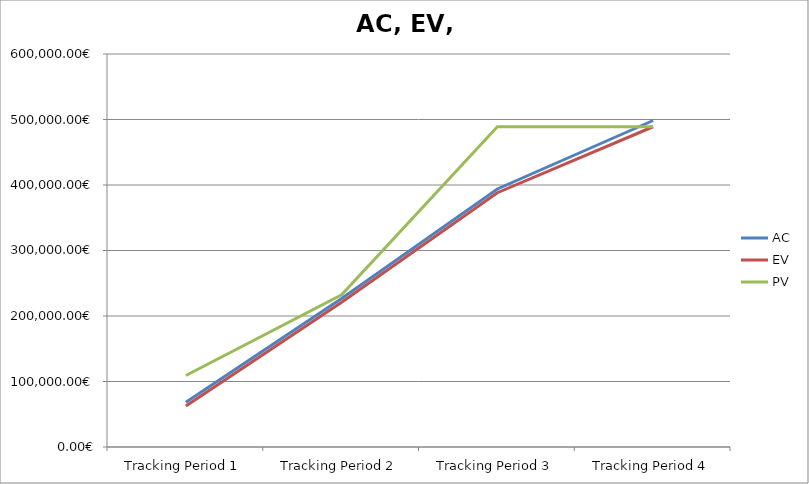
| Category | AC | EV | PV |
|---|---|---|---|
| Tracking Period 1 | 68380 | 62504 | 109197 |
| Tracking Period 2 | 226645 | 220944 | 232412 |
| Tracking Period 3 | 393895 | 388252 | 488936 |
| Tracking Period 4 | 498473 | 488936 | 488936 |